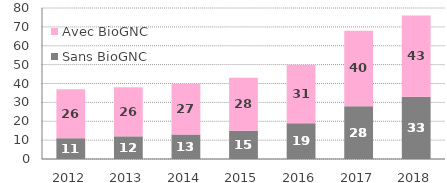
| Category | Sans BioGNC | Avec BioGNC |
|---|---|---|
| 2012.0 | 11 | 26 |
| 2013.0 | 12 | 26 |
| 2014.0 | 13 | 27 |
| 2015.0 | 15 | 28 |
| 2016.0 | 19 | 31 |
| 2017.0 | 28 | 40 |
| 2018.0 | 33 | 43 |